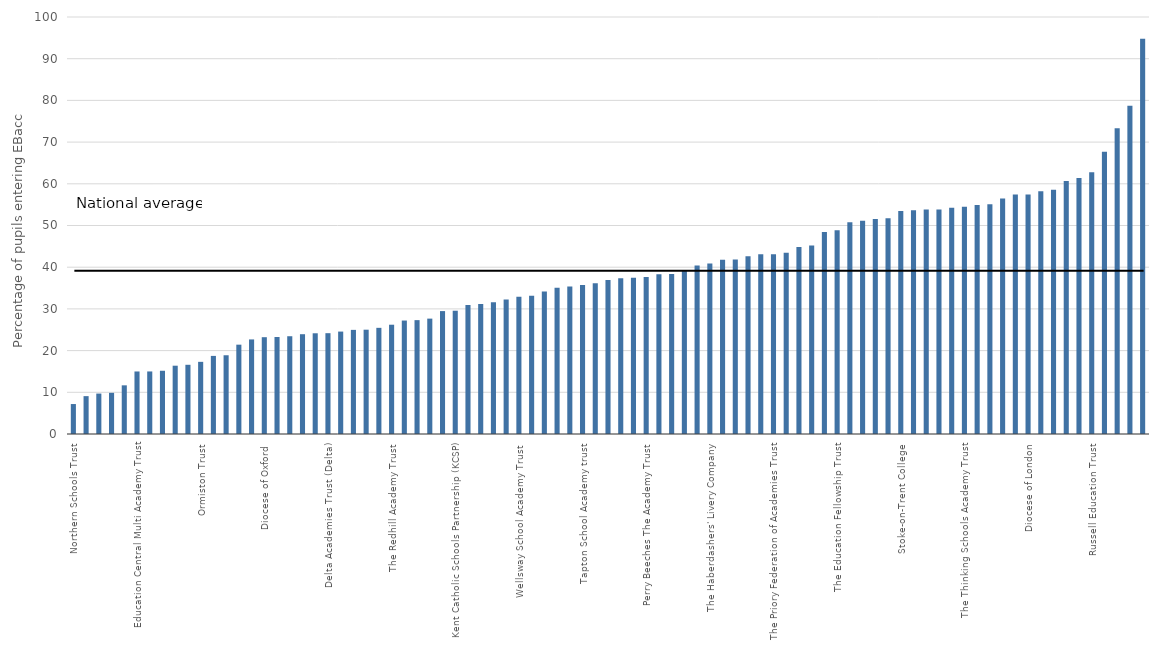
| Category | Series 0 |
|---|---|
| Northern Schools Trust | 7.185 |
| The Rodillian Multi Academy Trust | 9.082 |
| Grace Foundation | 9.699 |
| Aldridge Education | 9.872 |
| Outwood Grange Academies Trust | 11.671 |
| Education Central Multi Academy Trust | 14.996 |
| Swale Academies Trust | 15 |
| Fylde Coast Teaching School Ltd | 15.166 |
| Brook Learning Trust | 16.379 |
| Transforming Education in Norfolk (the TEN Group) | 16.597 |
| Ormiston Trust | 17.304 |
| Northern Education Trust | 18.728 |
| Wakefield City Academies Trust | 18.885 |
| Eastern Multi-Academy Trust | 21.422 |
| Cabot Learning Federation | 22.681 |
| Diocese of Oxford | 23.214 |
| Academies Enterprise Trust (AET) | 23.267 |
| The Heath Family Trust | 23.446 |
| CfBT Education Trust | 23.932 |
| The Midland Academies Trust | 24.154 |
| Delta Academies Trust (Delta) | 24.178 |
| E-ACT | 24.562 |
| Guildford Education Partnership | 24.97 |
| FPTA Academies (Fort Pitt Grammar School and The Thomas Aveling School) | 25.014 |
| Bright Tribe Trust | 25.459 |
| The Redhill Academy Trust | 26.207 |
| Inspiration Trust | 27.208 |
| Rosedale Hewens Academy Trust | 27.306 |
| The Co-operative Group | 27.669 |
| White Rose Trust | 29.475 |
| Kent Catholic Schools Partnership (KCSP) | 29.562 |
| United Learning | 30.959 |
| Landau Forte Charitable Trust | 31.204 |
| Kemnal Academy Trust, The (TKAT) | 31.613 |
| David Ross Education Trust (DRET) | 32.273 |
| Wellsway School Academy Trust | 32.933 |
| Leigh Academies Trust | 33.148 |
| Creative Education Trust | 34.171 |
| David Meller | 35.06 |
| Diverse Academies Trust | 35.371 |
| Tapton School Academy trust | 35.709 |
| Brooke Weston Trust | 36.173 |
| Oasis Community Learning | 36.912 |
| The GORSE Academies Trust | 37.337 |
| East Midlands Education Trust | 37.474 |
| Perry Beeches The Academy Trust | 37.64 |
| UCAT | 38.338 |
| Loxford School Trust Ltd | 38.365 |
| Woodard Academies Trust | 39.188 |
| Academy Transformation Trust (ATT) | 40.399 |
| The Haberdashers' Livery Company | 40.898 |
| The Spencer Academies Trust | 41.77 |
| Matrix Academy Trust | 41.861 |
| Carmel Education Trust | 42.603 |
| The Dean Trust | 43.089 |
| The Priory Federation of Academies Trust | 43.093 |
| The Skinners' Company | 43.483 |
| Coastal Academies Trust | 44.87 |
| Greenwood Academies Trust | 45.182 |
| Aspirations Academies Trust (AAT) | 48.448 |
| The Education Fellowship Trust | 48.842 |
| The Athelstan Trust | 50.771 |
| The Cam Academy Trust | 51.134 |
| The Castle School Education Trust | 51.552 |
| Community Academies Trust (CAT) | 51.731 |
| Stoke-on-Trent College | 53.507 |
| ARK Schools | 53.674 |
| Invictus Education Trust | 53.82 |
| Samuel Ward Academy Trust | 53.857 |
| Tudor Grange Academies Trust | 54.265 |
| The Thinking Schools Academy Trust | 54.505 |
| The Arthur Terry Learning Partnership | 54.9 |
| Cambridge Meridian Academies Trust (CMAT) | 55.08 |
| Bright Futures Educational Trust | 56.463 |
| The Seckford Foundation Free Schools Trust | 57.413 |
| Diocese of London | 57.427 |
| The Diocese of Westminster Academy Trust | 58.233 |
| Dixons Academy Trust | 58.574 |
| The Howard Partnership Trust | 60.646 |
| Harris Federation | 61.393 |
| Russell Education Trust | 62.771 |
| Bourne Education Trust | 67.697 |
| Great Schools Trust | 73.301 |
| City of London Academies Trust | 78.71 |
| Tauheedul Education Trust | 94.769 |